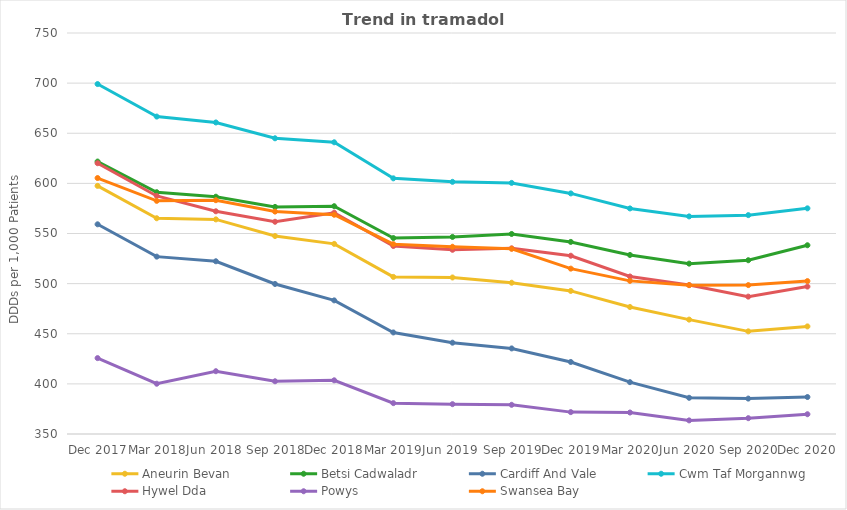
| Category | Aneurin Bevan | Betsi Cadwaladr | Cardiff And Vale | Cwm Taf Morgannwg | Hywel Dda | Powys | Swansea Bay |
|---|---|---|---|---|---|---|---|
| Dec 2017 | 597.517 | 621.76 | 559.179 | 699.073 | 620.121 | 425.701 | 605.327 |
| Mar 2018 | 565.214 | 591.174 | 526.927 | 666.642 | 587.461 | 400.15 | 582.567 |
| Jun 2018 | 564.07 | 586.692 | 522.296 | 660.763 | 572.167 | 412.632 | 583.223 |
| Sep 2018 | 547.493 | 576.517 | 499.644 | 644.97 | 561.712 | 402.592 | 571.867 |
| Dec 2018 | 539.64 | 577.229 | 483.298 | 640.982 | 570.742 | 403.56 | 568.694 |
| Mar 2019 | 506.707 | 545.441 | 451.298 | 605.029 | 537.523 | 380.789 | 539.363 |
| Jun 2019 | 506.136 | 546.583 | 441.074 | 601.529 | 533.743 | 379.758 | 536.782 |
| Sep 2019 | 500.894 | 549.522 | 435.359 | 600.475 | 535.195 | 379.109 | 534.743 |
| Dec 2019 | 492.721 | 541.607 | 421.845 | 589.988 | 527.819 | 371.823 | 514.949 |
| Mar 2020 | 476.691 | 528.58 | 401.702 | 575.009 | 507.104 | 371.427 | 502.743 |
| Jun 2020 | 464.103 | 519.938 | 386.112 | 567.046 | 498.589 | 363.579 | 498.472 |
| Sep 2020 | 452.395 | 523.333 | 385.327 | 568.319 | 487.027 | 365.777 | 498.526 |
| Dec 2020 | 457.32 | 538.284 | 386.883 | 575.098 | 497.056 | 369.717 | 502.518 |